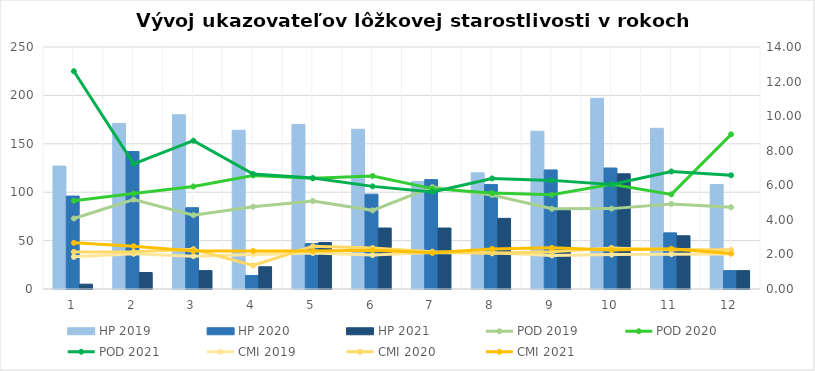
| Category | HP 2019 | HP 2020 | HP 2021 |
|---|---|---|---|
| 0 | 127 | 96 | 5 |
| 1 | 171 | 142 | 17 |
| 2 | 180 | 84 | 19 |
| 3 | 164 | 14 | 23 |
| 4 | 170 | 47 | 48 |
| 5 | 165 | 98 | 63 |
| 6 | 111 | 113 | 63 |
| 7 | 120 | 108 | 73 |
| 8 | 163 | 123 | 81 |
| 9 | 197 | 125 | 119 |
| 10 | 166 | 58 | 55 |
| 11 | 108 | 19 | 19 |